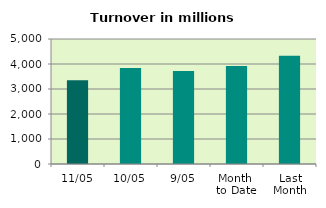
| Category | Series 0 |
|---|---|
| 11/05 | 3349.012 |
| 10/05 | 3839.657 |
| 9/05 | 3715.148 |
| Month 
to Date | 3920.656 |
| Last
Month | 4332.281 |